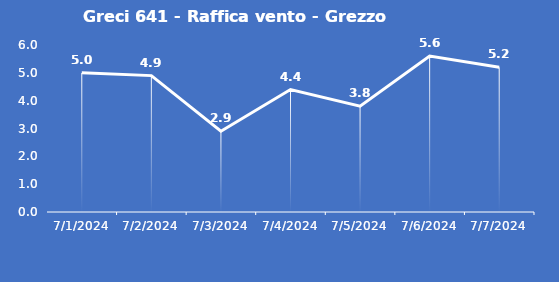
| Category | Greci 641 - Raffica vento - Grezzo (m/s) |
|---|---|
| 7/1/24 | 5 |
| 7/2/24 | 4.9 |
| 7/3/24 | 2.9 |
| 7/4/24 | 4.4 |
| 7/5/24 | 3.8 |
| 7/6/24 | 5.6 |
| 7/7/24 | 5.2 |